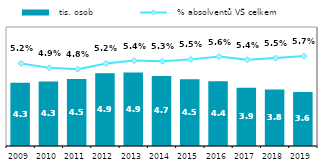
| Category |   tis. osob |
|---|---|
| 2009 | 4.253 |
| 2010 | 4.337 |
| 2011 | 4.507 |
| 2012 | 4.893 |
| 2013 | 4.934 |
| 2014 | 4.711 |
| 2015 | 4.479 |
| 2016 | 4.361 |
| 2017 | 3.916 |
| 2018 | 3.802 |
| 2019 | 3.638 |